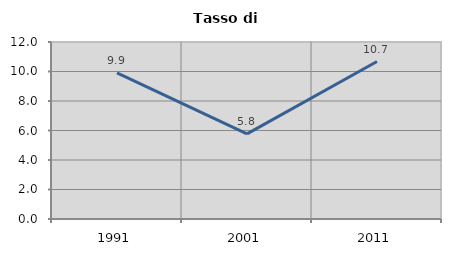
| Category | Tasso di disoccupazione   |
|---|---|
| 1991.0 | 9.901 |
| 2001.0 | 5.773 |
| 2011.0 | 10.676 |